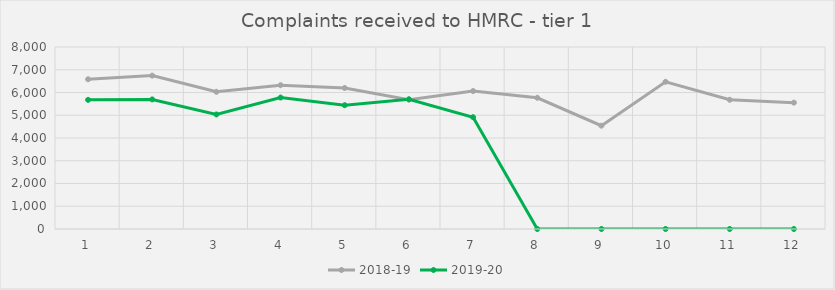
| Category | 2018-19 | 2019-20 |
|---|---|---|
| 0 | 6583 | 5676 |
| 1 | 6742 | 5696 |
| 2 | 6030 | 5035 |
| 3 | 6321 | 5779 |
| 4 | 6198 | 5441 |
| 5 | 5686 | 5703 |
| 6 | 6065 | 4915 |
| 7 | 5768 | 0 |
| 8 | 4540 | 0 |
| 9 | 6471 | 0 |
| 10 | 5680 | 0 |
| 11 | 5554 | 0 |